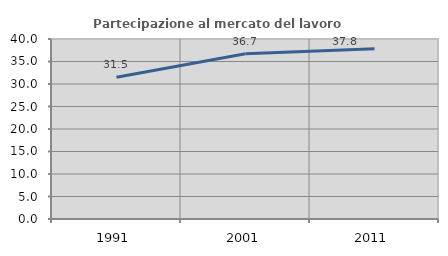
| Category | Partecipazione al mercato del lavoro  femminile |
|---|---|
| 1991.0 | 31.497 |
| 2001.0 | 36.719 |
| 2011.0 | 37.842 |